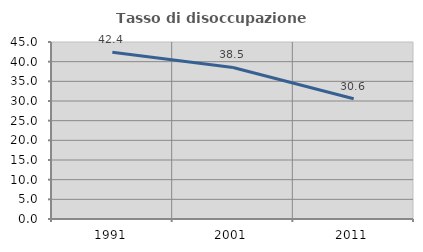
| Category | Tasso di disoccupazione giovanile  |
|---|---|
| 1991.0 | 42.408 |
| 2001.0 | 38.519 |
| 2011.0 | 30.556 |